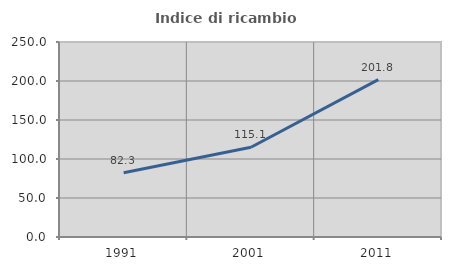
| Category | Indice di ricambio occupazionale  |
|---|---|
| 1991.0 | 82.278 |
| 2001.0 | 115.068 |
| 2011.0 | 201.754 |